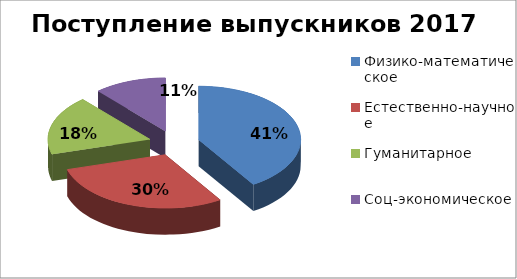
| Category | Series 0 |
|---|---|
| Физико-математическое | 25 |
| Естественно-научное | 18 |
| Гуманитарное | 11 |
| Соц-экономическое | 7 |